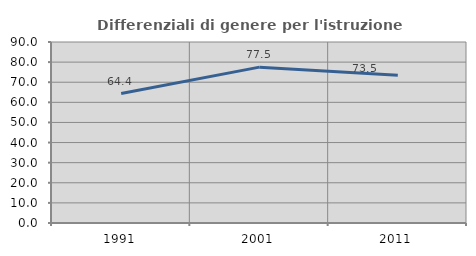
| Category | Differenziali di genere per l'istruzione superiore |
|---|---|
| 1991.0 | 64.359 |
| 2001.0 | 77.501 |
| 2011.0 | 73.488 |